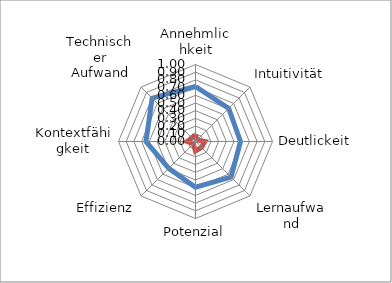
| Category | Series 0 | Series 1 |
|---|---|---|
| Annehmlichkeit | 0.714 | 0.089 |
| Intuitivität | 0.61 | 0.025 |
| Deutlickeit | 0.584 | 0.122 |
| Lernaufwand | 0.653 | 0.109 |
| Potenzial | 0.593 | 0.124 |
| Effizienz | 0.492 | 0.041 |
| Kontextfähigkeit | 0.643 | 0.107 |
| Technischer Aufwand | 0.796 | 0.066 |